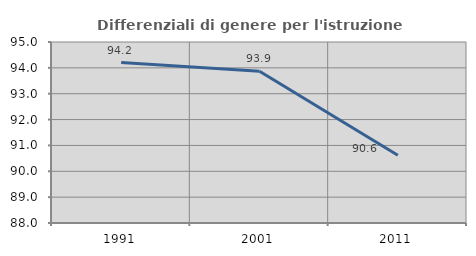
| Category | Differenziali di genere per l'istruzione superiore |
|---|---|
| 1991.0 | 94.205 |
| 2001.0 | 93.869 |
| 2011.0 | 90.617 |